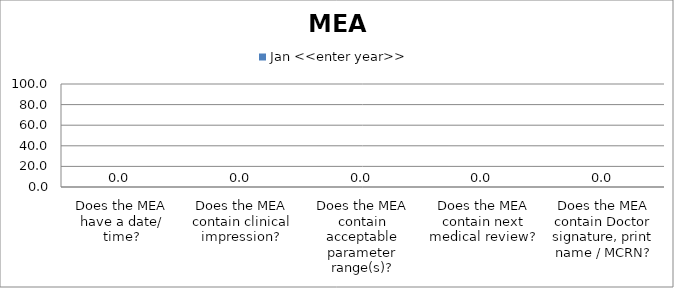
| Category | Jan <<enter year>> |
|---|---|
| Does the MEA have a date/ time? | 0 |
| Does the MEA contain clinical impression? | 0 |
| Does the MEA contain acceptable parameter range(s)? | 0 |
| Does the MEA contain next medical review? | 0 |
| Does the MEA contain Doctor signature, print name / MCRN? | 0 |